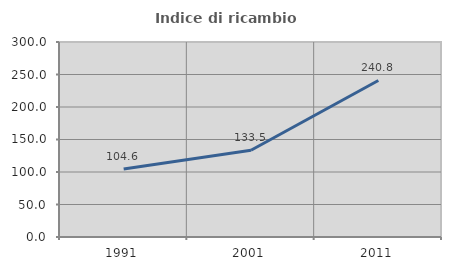
| Category | Indice di ricambio occupazionale  |
|---|---|
| 1991.0 | 104.577 |
| 2001.0 | 133.482 |
| 2011.0 | 240.828 |